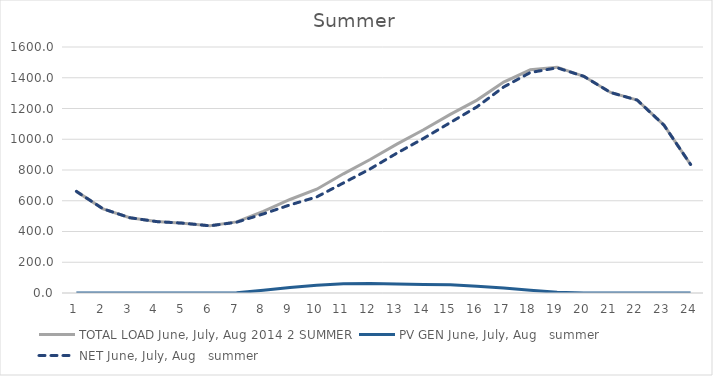
| Category | TOTAL LOAD | PV GEN | NET |
|---|---|---|---|
| 0 | 660.983 | 0 | 660.983 |
| 1 | 547.348 | 0 | 547.348 |
| 2 | 489.774 | 0 | 489.774 |
| 3 | 464.461 | 0 | 464.461 |
| 4 | 454.139 | 0 | 454.139 |
| 5 | 436.986 | 0.047 | 436.939 |
| 6 | 462.384 | 2.058 | 460.326 |
| 7 | 531.53 | 17.205 | 514.325 |
| 8 | 608.199 | 35.079 | 573.12 |
| 9 | 675.263 | 50.348 | 624.914 |
| 10 | 775.207 | 59.482 | 715.725 |
| 11 | 868.522 | 61.348 | 807.174 |
| 12 | 968.591 | 59.171 | 909.42 |
| 13 | 1061.454 | 55.871 | 1005.584 |
| 14 | 1162.003 | 53.545 | 1108.459 |
| 15 | 1254.631 | 43.764 | 1210.866 |
| 16 | 1372.212 | 32.204 | 1340.007 |
| 17 | 1451.824 | 17.616 | 1434.208 |
| 18 | 1468.919 | 4.302 | 1464.617 |
| 19 | 1409.291 | 0.033 | 1409.257 |
| 20 | 1304.291 | 0 | 1304.291 |
| 21 | 1254.436 | 0 | 1254.436 |
| 22 | 1092.036 | 0 | 1092.036 |
| 23 | 835.389 | 0 | 835.389 |